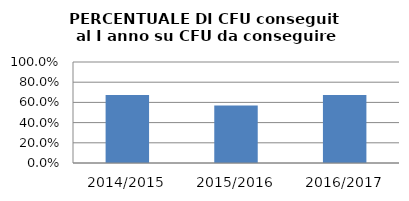
| Category | 2014/2015 2015/2016 2016/2017 |
|---|---|
| 2014/2015 | 0.673 |
| 2015/2016 | 0.569 |
| 2016/2017 | 0.674 |